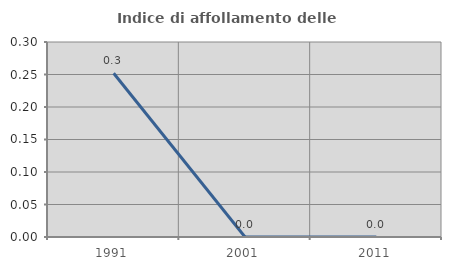
| Category | Indice di affollamento delle abitazioni  |
|---|---|
| 1991.0 | 0.252 |
| 2001.0 | 0 |
| 2011.0 | 0 |